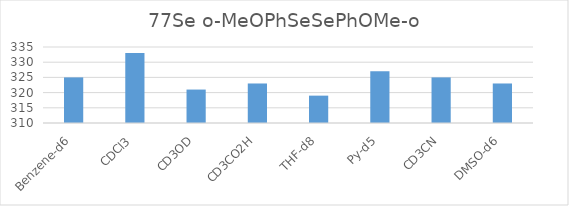
| Category | 77Se o-MeOPhSeSePhOMe-p |
|---|---|
| Benzene-d6 | 325 |
| CDCl3 | 333 |
| CD3OD | 321 |
| CD3CO2H | 323 |
| THF-d8 | 319 |
| Py-d5 | 327 |
| CD3CN | 325 |
| DMSO-d6 | 323 |